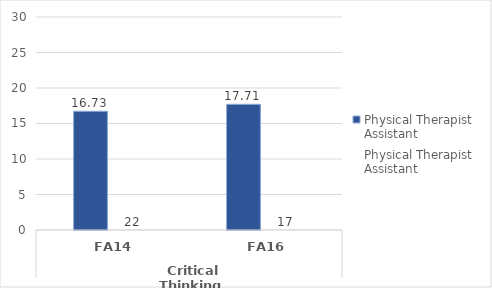
| Category | Average of outcome score - Physical Therapist Assistant | Count of outcome score - Physical Therapist Assistant |
|---|---|---|
| 0 | 16.727 | 22 |
| 1 | 17.706 | 17 |